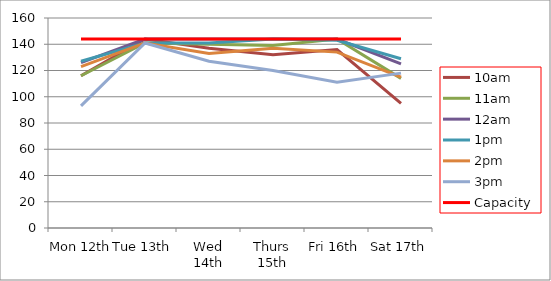
| Category | 9am | 10am | 11am | 12am | 1pm | 2pm | 3pm | 4pm | 5pm | Capacity |
|---|---|---|---|---|---|---|---|---|---|---|
| Mon 12th |  | 116 | 116 | 126 | 127 | 123 | 93 |  |  | 144 |
| Tue 13th |  | 144 | 141 | 144 | 141 | 141 | 141 |  |  | 144 |
| Wed 14th |  | 137 | 140 | 144 | 141 | 133 | 127 |  |  | 144 |
| Thurs 15th |  | 132 | 139 | 144 | 144 | 137 | 120 |  |  | 144 |
| Fri 16th |  | 136 | 144 | 144 | 143 | 134 | 111 |  |  | 144 |
| Sat 17th |  | 95 | 114 | 125 | 129 | 115 | 118 |  |  | 144 |